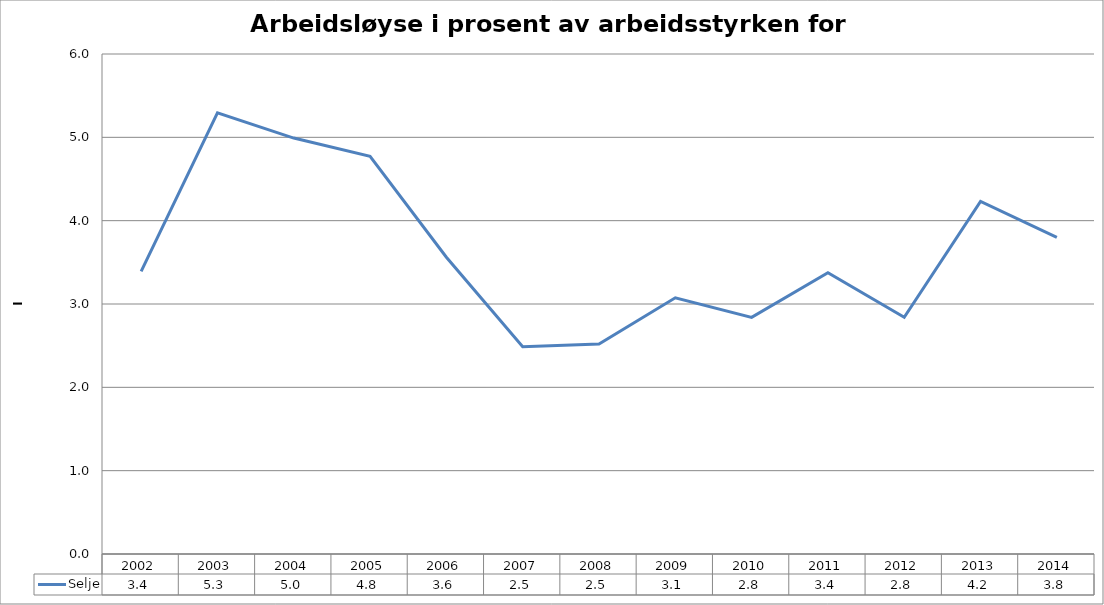
| Category | Selje |
|---|---|
| 2002.0 | 3.391 |
| 2003.0 | 5.294 |
| 2004.0 | 4.991 |
| 2005.0 | 4.772 |
| 2006.0 | 3.561 |
| 2007.0 | 2.486 |
| 2008.0 | 2.52 |
| 2009.0 | 3.074 |
| 2010.0 | 2.839 |
| 2011.0 | 3.374 |
| 2012.0 | 2.842 |
| 2013.0 | 4.23 |
| 2014.0 | 3.8 |